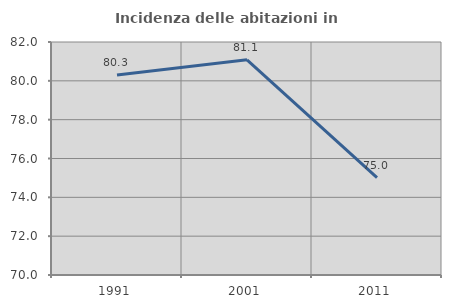
| Category | Incidenza delle abitazioni in proprietà  |
|---|---|
| 1991.0 | 80.302 |
| 2001.0 | 81.084 |
| 2011.0 | 75.013 |